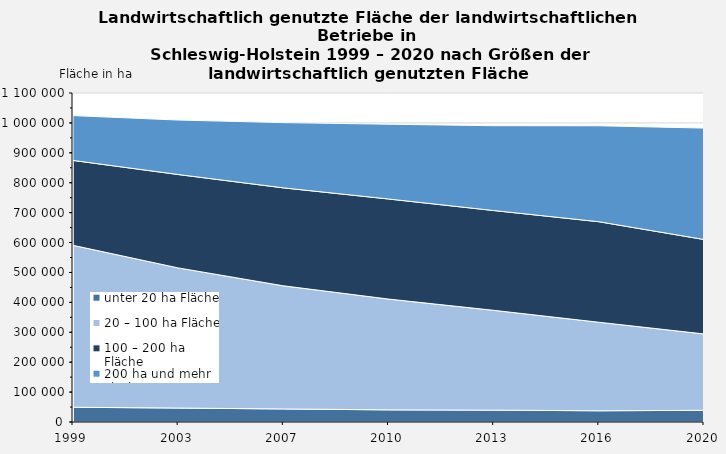
| Category | unter 20 ha Fläche | 20 – 100 ha Fläche | 100 – 200 ha Fläche | 200 ha und mehr Fläche |
|---|---|---|---|---|
| 1999.0 | 49317 | 541374 | 283851 | 149910 |
| 2003.0 | 46642 | 468569 | 312239 | 182135 |
| 2007.0 | 43587 | 411791 | 327419 | 218157 |
| 2010.0 | 40574 | 370441 | 334608 | 250014 |
| 2013.0 | 39700 | 333700 | 333600 | 283600 |
| 2016.0 | 37523 | 296037 | 336037 | 320805 |
| 2020.0 | 39166 | 255198 | 315803 | 372586 |